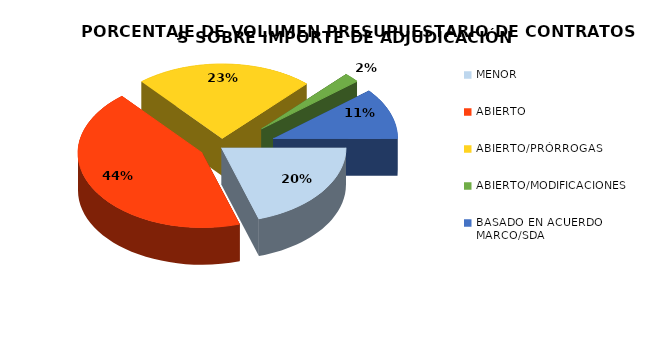
| Category |  PORCENTAJE DE VOLUMEN PRESUPUESTARIO DE CONTRATOS A TRAVÉS DE LOS PROCEDIMIENTOS DE ADJUDICACIÓN |
|---|---|
| MENOR | 0.201 |
| ABIERTO | 0.437 |
| ABIERTO/PRÓRROGAS | 0.231 |
| ABIERTO/MODIFICACIONES | 0.021 |
| BASADO EN ACUERDO MARCO/SDA | 0.11 |